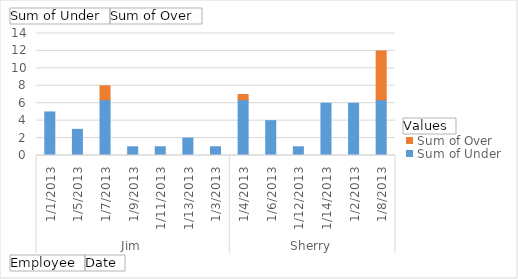
| Category | Sum of Under | Sum of Over |
|---|---|---|
| 0 | 5 | 0 |
| 1 | 3 | 0 |
| 2 | 6.4 | 1.6 |
| 3 | 1 | 0 |
| 4 | 1 | 0 |
| 5 | 2 | 0 |
| 6 | 1 | 0 |
| 7 | 6.4 | 0.6 |
| 8 | 4 | 0 |
| 9 | 1 | 0 |
| 10 | 6 | 0 |
| 11 | 6 | 0 |
| 12 | 6.4 | 5.6 |